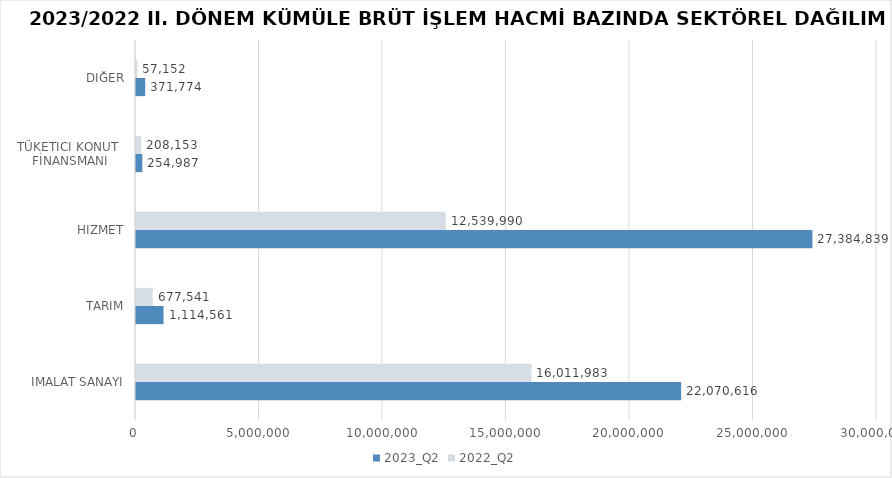
| Category | 2023_Q2 | 2022_Q2 |
|---|---|---|
| İMALAT SANAYİ | 22070616.417 | 16011983.02 |
| TARIM | 1114560.537 | 677541.183 |
| HİZMET | 27384839.005 | 12539990.332 |
| TÜKETİCİ KONUT 
FİNANSMANI | 254987 | 208153 |
| DİĞER | 371774 | 57152 |